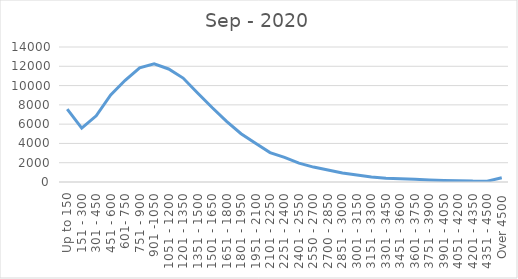
| Category | Sep - 2020 |
|---|---|
| Up to 150 | 7556 |
| 151 - 300 | 5586 |
| 301 - 450 | 6864 |
| 451 - 600 | 9025 |
| 601- 750 | 10552 |
| 751 - 900 | 11849 |
| 901 -1050 | 12265 |
| 1051 - 1200 | 11722 |
| 1201 - 1350 | 10777 |
| 1351 - 1500 | 9226 |
| 1501 - 1650 | 7721 |
| 1651 - 1800 | 6282 |
| 1801 - 1950 | 5004 |
| 1951 - 2100 | 4014 |
| 2101 - 2250 | 3053 |
| 2251 - 2400 | 2551 |
| 2401 - 2550 | 1954 |
| 2550 - 2700 | 1546 |
| 2700 - 2850 | 1236 |
| 2851 - 3000 | 943 |
| 3001 - 3150 | 717 |
| 3151 - 3300 | 523 |
| 3301 - 3450 | 401 |
| 3451 - 3600 | 328 |
| 3601 - 3750 | 275 |
| 3751 - 3900 | 209 |
| 3901 - 4050 | 162 |
| 4051 - 4200 | 140 |
| 4201 - 4350 | 92 |
| 4351 - 4500 | 84 |
| Over 4500 | 442 |